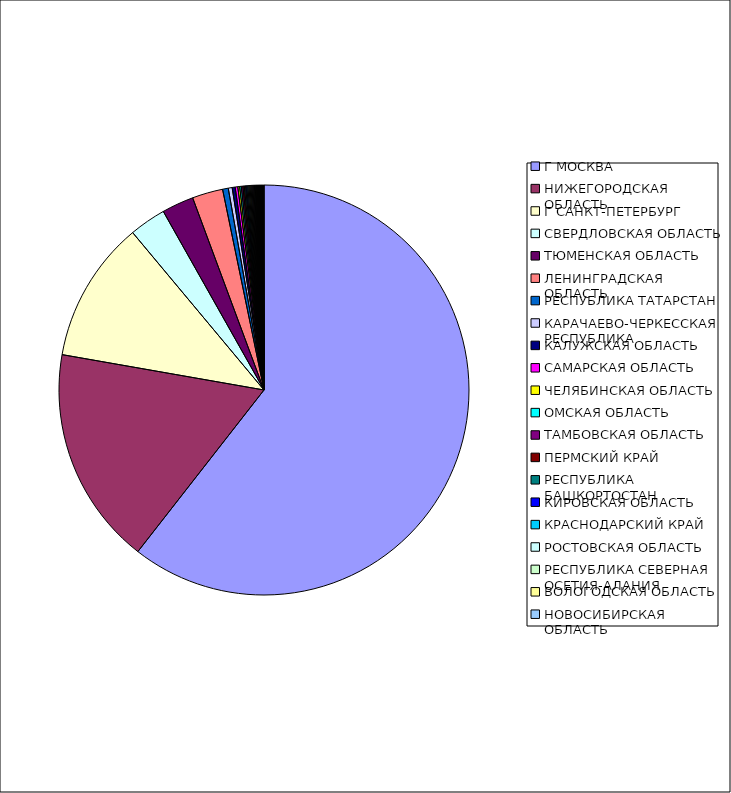
| Category | Оборот |
|---|---|
| Г МОСКВА | 0.605 |
| НИЖЕГОРОДСКАЯ ОБЛАСТЬ | 0.172 |
| Г САНКТ-ПЕТЕРБУРГ | 0.112 |
| СВЕРДЛОВСКАЯ ОБЛАСТЬ | 0.029 |
| ТЮМЕНСКАЯ ОБЛАСТЬ | 0.025 |
| ЛЕНИНГРАДСКАЯ ОБЛАСТЬ | 0.024 |
| РЕСПУБЛИКА ТАТАРСТАН | 0.004 |
| КАРАЧАЕВО-ЧЕРКЕССКАЯ РЕСПУБЛИКА | 0.003 |
| КАЛУЖСКАЯ ОБЛАСТЬ | 0.002 |
| САМАРСКАЯ ОБЛАСТЬ | 0.002 |
| ЧЕЛЯБИНСКАЯ ОБЛАСТЬ | 0.001 |
| ОМСКАЯ ОБЛАСТЬ | 0.001 |
| ТАМБОВСКАЯ ОБЛАСТЬ | 0.001 |
| ПЕРМСКИЙ КРАЙ | 0.001 |
| РЕСПУБЛИКА БАШКОРТОСТАН | 0.001 |
| КИРОВСКАЯ ОБЛАСТЬ | 0.001 |
| КРАСНОДАРСКИЙ КРАЙ | 0.001 |
| РОСТОВСКАЯ ОБЛАСТЬ | 0.001 |
| РЕСПУБЛИКА СЕВЕРНАЯ ОСЕТИЯ-АЛАНИЯ | 0.001 |
| ВОЛОГОДСКАЯ ОБЛАСТЬ | 0.001 |
| НОВОСИБИРСКАЯ ОБЛАСТЬ | 0.001 |
| САРАТОВСКАЯ ОБЛАСТЬ | 0.001 |
| РЯЗАНСКАЯ ОБЛАСТЬ | 0.001 |
| СМОЛЕНСКАЯ ОБЛАСТЬ | 0.001 |
| ИВАНОВСКАЯ ОБЛАСТЬ | 0.001 |
| ХАБАРОВСКИЙ КРАЙ | 0.001 |
| РЕСПУБЛИКА ДАГЕСТАН | 0 |
| РЕСПУБЛИКА МОРДОВИЯ | 0 |
| ТУЛЬСКАЯ ОБЛАСТЬ | 0 |
| ЛИПЕЦКАЯ ОБЛАСТЬ | 0 |
| УЛЬЯНОВСКАЯ ОБЛАСТЬ | 0 |
| АЛТАЙСКИЙ КРАЙ | 0 |
| РЕСПУБЛИКА КОМИ | 0 |
| ЧУВАШСКАЯ РЕСПУБЛИКА | 0 |
| РЕСПУБЛИКА САХА(ЯКУТИЯ) | 0 |
| ТВЕРСКАЯ ОБЛАСТЬ | 0 |
| ОРЕНБУРГСКАЯ ОБЛАСТЬ | 0 |
| ИРКУТСКАЯ ОБЛАСТЬ | 0 |
| МОСКОВСКАЯ ОБЛАСТЬ | 0 |
| УДМУРТСКАЯ РЕСПУБЛИКА | 0 |
| БЕЛГОРОДСКАЯ ОБЛАСТЬ | 0 |
| КУРГАНСКАЯ ОБЛАСТЬ | 0 |
| ВОРОНЕЖСКАЯ ОБЛАСТЬ | 0 |
| КАБАРДИНО-БАЛКАРСКАЯ РЕСПУБЛИКА | 0 |
| ПСКОВСКАЯ ОБЛАСТЬ | 0 |
| СТАВРОПОЛЬСКИЙ КРАЙ | 0 |